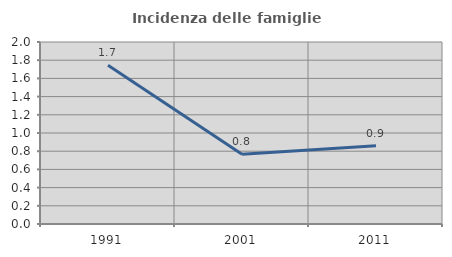
| Category | Incidenza delle famiglie numerose |
|---|---|
| 1991.0 | 1.744 |
| 2001.0 | 0.766 |
| 2011.0 | 0.86 |